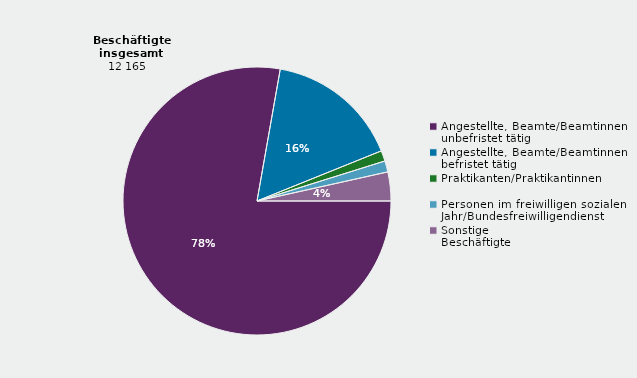
| Category | Series 0 |
|---|---|
| Angestellte, Beamte/Beamtinnen unbefristet tätig | 77.781 |
| Angestellte, Beamte/Beamtinnen befristet tätig | 16.12 |
| Praktikanten/Praktikantinnen | 1.274 |
| Personen im freiwilligen sozialen Jahr/Bundesfreiwilligendienst | 1.34 |
| Sonstige
Beschäftigte | 3.485 |